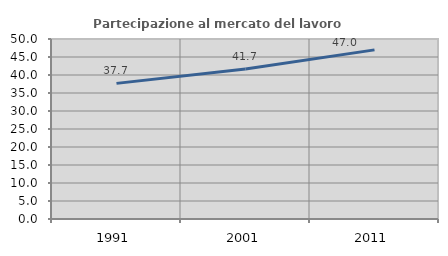
| Category | Partecipazione al mercato del lavoro  femminile |
|---|---|
| 1991.0 | 37.674 |
| 2001.0 | 41.674 |
| 2011.0 | 46.983 |